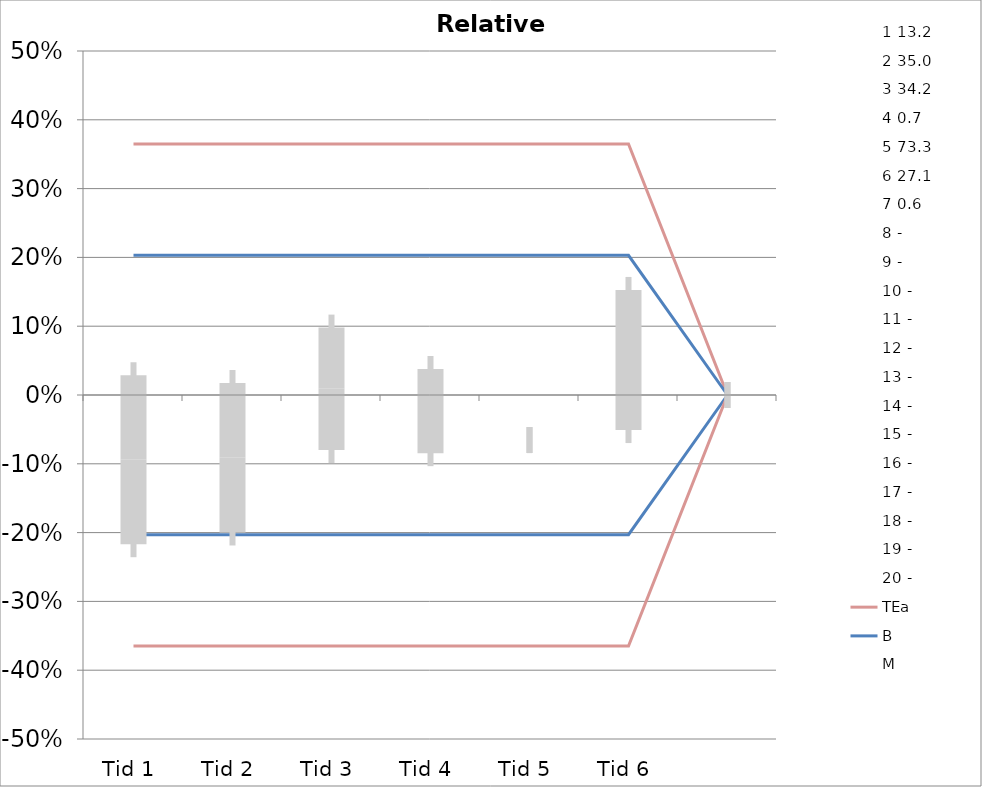
| Category | 1 | 2 | 3 | 4 | 5 | 6 | 7 | 8 | 9 | 10 | 11 | 12 | 13 | 14 | 15 | 16 | 17 | 18 | 19 | 20 | TEa | B | -B | -TEa | M |
|---|---|---|---|---|---|---|---|---|---|---|---|---|---|---|---|---|---|---|---|---|---|---|---|---|---|
| Tid 1 | -0.023 | -0.166 | -0.07 | -0.143 | 0.025 | 0.052 | -0.333 | 0 | 0 | 0 | 0 | 0 | 0 | 0 | 0 | 0 | 0 | 0 | 0 | 0 | 0.365 | 0.203 | -0.203 | -0.365 | -0.094 |
| Tid 2 | -0.03 | -0.069 | -0.061 | -0.143 | 0.005 | -0.007 | -0.333 | 0 | 0 | 0 | 0 | 0 | 0 | 0 | 0 | 0 | 0 | 0 | 0 | 0 | 0.365 | 0.203 | -0.203 | -0.365 | -0.091 |
| Tid 3 | 0.038 | -0.017 | -0.015 | 0.143 | 0.003 | 0.077 | -0.167 | 0 | 0 | 0 | 0 | 0 | 0 | 0 | 0 | 0 | 0 | 0 | 0 | 0 | 0.365 | 0.203 | -0.203 | -0.365 | 0.009 |
| Tid 4 | -0.008 | -0.06 | -0.041 | -0.143 | 0.029 | 0.059 | 0 | 0 | 0 | 0 | 0 | 0 | 0 | 0 | 0 | 0 | 0 | 0 | 0 | 0 | 0.365 | 0.203 | -0.203 | -0.365 | -0.023 |
| Tid 5 | 0 | 0 | 0 | 0 | -0.065 | 0 | 0 | 0 | 0 | 0 | 0 | 0 | 0 | 0 | 0 | 0 | 0 | 0 | 0 | 0 | 0.365 | 0.203 | -0.203 | -0.365 | -0.065 |
| Tid 6 | 0 | 0 | 0 | 0.143 | 0.016 | 0.044 | 0 | 0 | 0 | 0 | 0 | 0 | 0 | 0 | 0 | 0 | 0 | 0 | 0 | 0 | 0.365 | 0.203 | -0.203 | -0.365 | 0.051 |